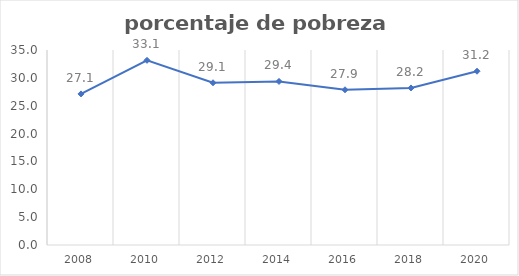
| Category | Series 0 |
|---|---|
| 2008.0 | 27.117 |
| 2010.0 | 33.149 |
| 2012.0 | 29.12 |
| 2014.0 | 29.358 |
| 2016.0 | 27.864 |
| 2018.0 | 28.185 |
| 2020.0 | 31.19 |